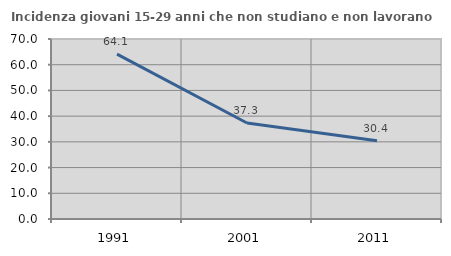
| Category | Incidenza giovani 15-29 anni che non studiano e non lavorano  |
|---|---|
| 1991.0 | 64.139 |
| 2001.0 | 37.344 |
| 2011.0 | 30.441 |